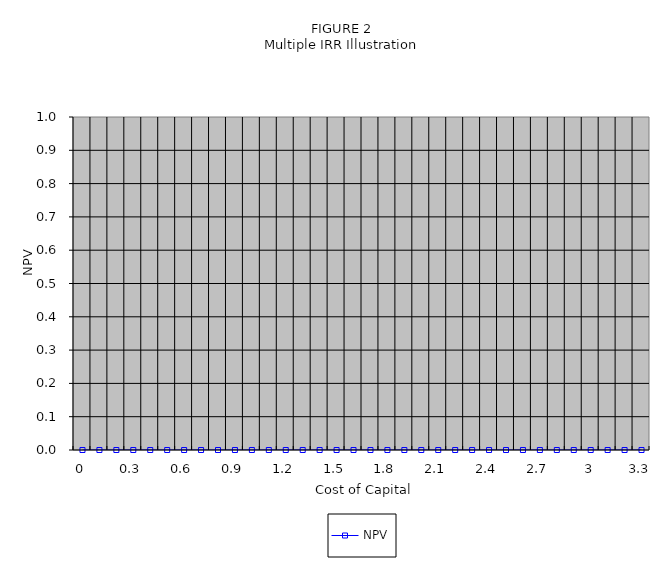
| Category | NPV |
|---|---|
| 0.0 | 0 |
| 0.1 | 0 |
| 0.2 | 0 |
| 0.3 | 0 |
| 0.4 | 0 |
| 0.5 | 0 |
| 0.6 | 0 |
| 0.7 | 0 |
| 0.8 | 0 |
| 0.9 | 0 |
| 1.0 | 0 |
| 1.1 | 0 |
| 1.2 | 0 |
| 1.3 | 0 |
| 1.4 | 0 |
| 1.5 | 0 |
| 1.6 | 0 |
| 1.7 | 0 |
| 1.8 | 0 |
| 1.9 | 0 |
| 2.0 | 0 |
| 2.1 | 0 |
| 2.2 | 0 |
| 2.3 | 0 |
| 2.4 | 0 |
| 2.5 | 0 |
| 2.6 | 0 |
| 2.7 | 0 |
| 2.8 | 0 |
| 2.9 | 0 |
| 3.0 | 0 |
| 3.1 | 0 |
| 3.2 | 0 |
| 3.3 | 0 |